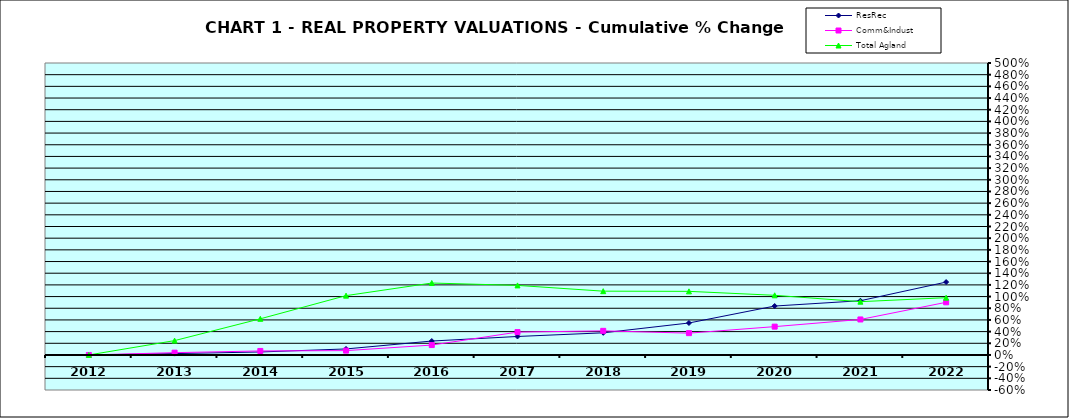
| Category | ResRec | Comm&Indust | Total Agland |
|---|---|---|---|
| 2012.0 | 0 | 0 | 0 |
| 2013.0 | 0.023 | 0.039 | 0.246 |
| 2014.0 | 0.051 | 0.069 | 0.619 |
| 2015.0 | 0.103 | 0.074 | 1.016 |
| 2016.0 | 0.239 | 0.169 | 1.232 |
| 2017.0 | 0.317 | 0.392 | 1.191 |
| 2018.0 | 0.379 | 0.413 | 1.093 |
| 2019.0 | 0.548 | 0.374 | 1.089 |
| 2020.0 | 0.838 | 0.485 | 1.022 |
| 2021.0 | 0.929 | 0.608 | 0.912 |
| 2022.0 | 1.248 | 0.902 | 0.981 |